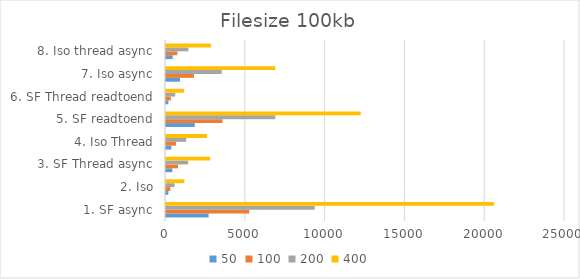
| Category | 50 | 100 | 200 | 400 |
|---|---|---|---|---|
| 1. SF async | 2668 | 5214 | 9322 | 20555 |
| 2. Iso | 148 | 273 | 540 | 1152 |
| 3. SF Thread async | 396 | 752 | 1387 | 2775 |
| 4. Iso Thread | 334 | 632 | 1267 | 2568 |
| 5. SF readtoend | 1804 | 3537 | 6850 | 12201 |
| 6. SF Thread readtoend | 149 | 304 | 578 | 1135 |
| 7. Iso async | 877 | 1755 | 3490 | 6854 |
| 8. Iso thread async | 419 | 714 | 1404 | 2815 |